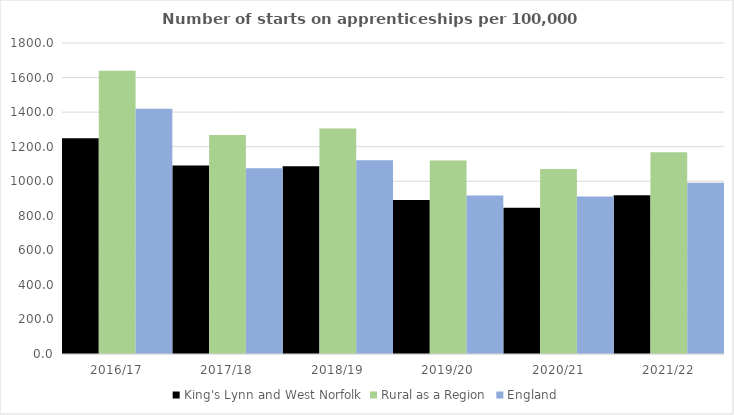
| Category | King's Lynn and West Norfolk | Rural as a Region | England |
|---|---|---|---|
| 2016/17 | 1248 | 1638.789 | 1420 |
| 2017/18 | 1091 | 1267.474 | 1075 |
| 2018/19 | 1087 | 1304.57 | 1122 |
| 2019/20 | 891 | 1119.662 | 918 |
| 2020/21 | 847 | 1070.748 | 912 |
| 2021/22 | 919 | 1167.68 | 991 |